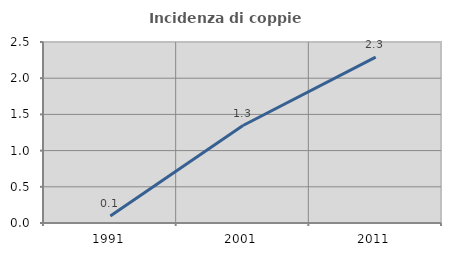
| Category | Incidenza di coppie miste |
|---|---|
| 1991.0 | 0.098 |
| 2001.0 | 1.346 |
| 2011.0 | 2.292 |